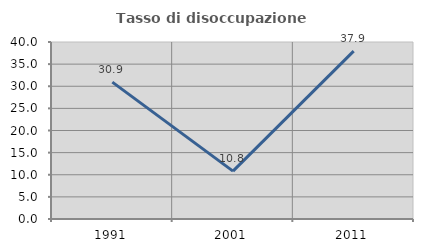
| Category | Tasso di disoccupazione giovanile  |
|---|---|
| 1991.0 | 30.928 |
| 2001.0 | 10.811 |
| 2011.0 | 37.931 |